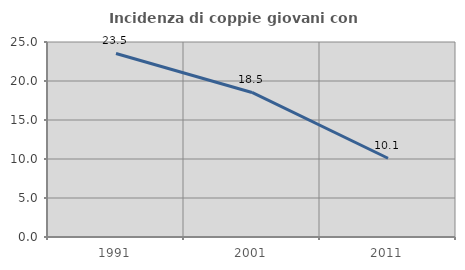
| Category | Incidenza di coppie giovani con figli |
|---|---|
| 1991.0 | 23.529 |
| 2001.0 | 18.531 |
| 2011.0 | 10.093 |